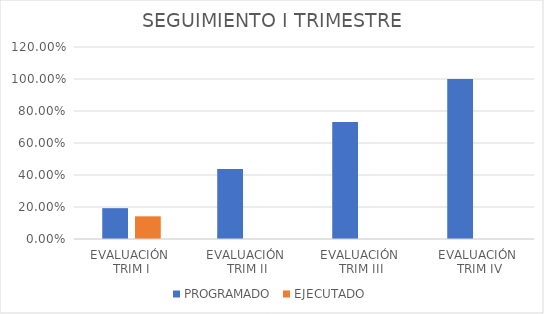
| Category | PROGRAMADO | EJECUTADO |
|---|---|---|
| EVALUACIÓN 
TRIM I | 0.193 | 0.142 |
| EVALUACIÓN 
TRIM II | 0.438 | 0 |
| EVALUACIÓN 
TRIM III | 0.731 | 0 |
| EVALUACIÓN
 TRIM IV | 1 | 0 |